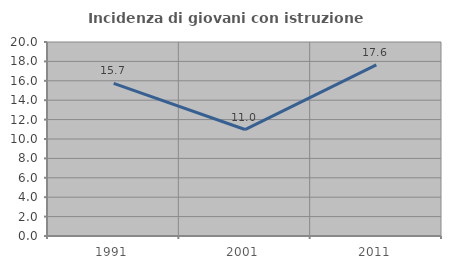
| Category | Incidenza di giovani con istruzione universitaria |
|---|---|
| 1991.0 | 15.73 |
| 2001.0 | 10.976 |
| 2011.0 | 17.647 |